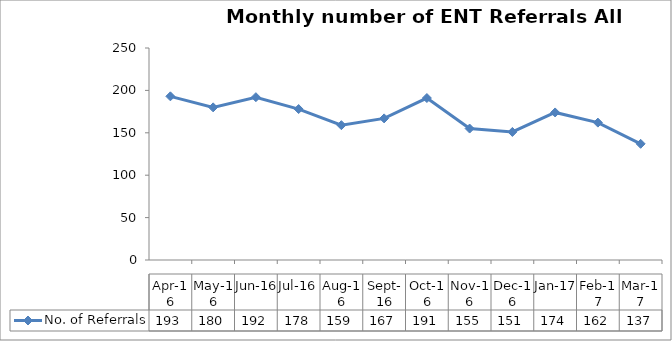
| Category | No. of Referrals |
|---|---|
| 2016-04-01 | 193 |
| 2016-05-01 | 180 |
| 2016-06-01 | 192 |
| 2016-07-01 | 178 |
| 2016-08-01 | 159 |
| 2016-09-01 | 167 |
| 2016-10-01 | 191 |
| 2016-11-01 | 155 |
| 2016-12-01 | 151 |
| 2017-01-01 | 174 |
| 2017-02-01 | 162 |
| 2017-03-01 | 137 |